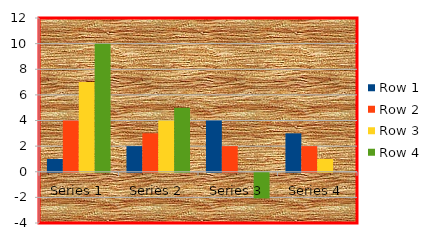
| Category | Row 1 | Row 2 | Row 3 | Row 4 |
|---|---|---|---|---|
| Series 1 | 1 | 4 | 7 | 10 |
| Series 2 | 2 | 3 | 4 | 5 |
| Series 3 | 4 | 2 | 0 | -2 |
| Series 4 | 3 | 2 | 1 | 0 |